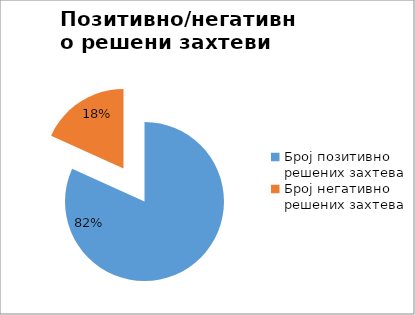
| Category | Series 0 |
|---|---|
| Број позитивно решених захтева | 42230 |
| Број негативно решених захтева | 9408 |